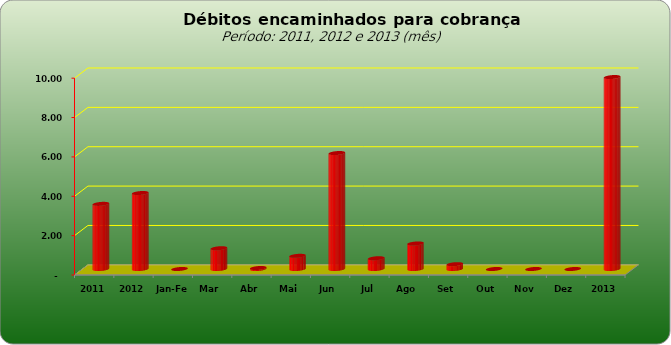
| Category |  3.309.443,02   3.859.728,44   -     1.053.903,71   50.529,60   669.296,13   5.890.806,29   546.448,11   1.296.316,32   245.030,62   -     -     -     9.752.330,78  |
|---|---|
| 2011 | 3309443.02 |
| 2012 | 3859728.44 |
| Jan-Fev | 0 |
| Mar | 1053903.71 |
| Abr | 50529.6 |
| Mai | 669296.13 |
| Jun | 5890806.29 |
| Jul | 546448.11 |
| Ago | 1296316.32 |
| Set | 245030.62 |
| Out | 0 |
| Nov | 0 |
| Dez | 0 |
| 2013 | 9752330.78 |